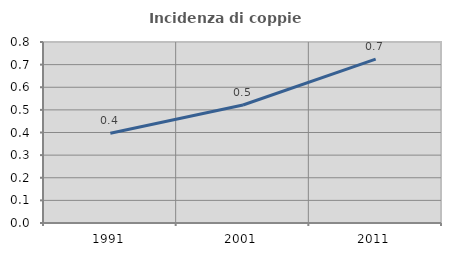
| Category | Incidenza di coppie miste |
|---|---|
| 1991.0 | 0.397 |
| 2001.0 | 0.521 |
| 2011.0 | 0.725 |